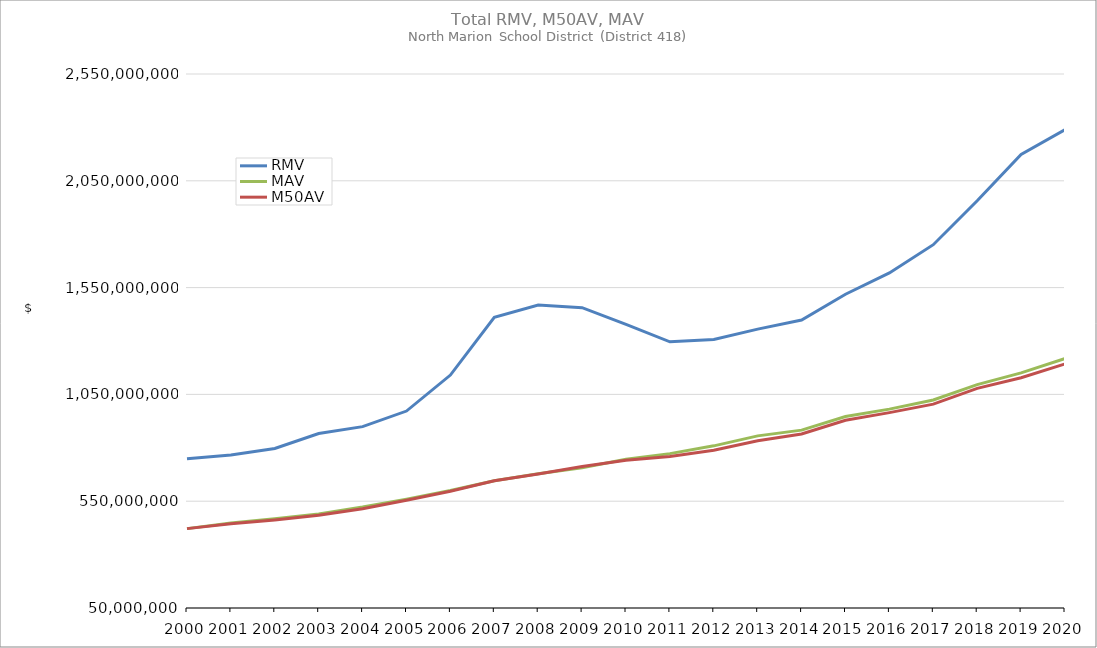
| Category | RMV | MAV | M50AV |
|---|---|---|---|
| 2000.0 | 748442697 | 421626962 | 421624970 |
| 2001.0 | 766622245 | 447420121 | 444534563 |
| 2002.0 | 796523828 | 467546030 | 462523133 |
| 2003.0 | 866915146 | 490197947 | 484249673 |
| 2004.0 | 899188326 | 522474164 | 515009715 |
| 2005.0 | 972078687 | 559697803 | 554751864 |
| 2006.0 | 1140555730 | 599814043 | 596354579 |
| 2007.0 | 1410534043 | 646142942 | 645790557 |
| 2008.0 | 1468187447 | 678929714 | 677095254 |
| 2009.0 | 1456028941 | 706872454 | 712036013 |
| 2010.0 | 1377549049 | 746715412 | 741252470 |
| 2011.0 | 1296366771 | 772769880 | 759396014 |
| 2012.0 | 1307324621 | 809173252 | 788333297 |
| 2013.0 | 1355682811 | 855796494 | 832774398 |
| 2014.0 | 1397917663 | 882651467 | 864750366 |
| 2015.0 | 1518853859 | 946556636 | 928581818 |
| 2016.0 | 1618630529 | 981106465 | 964772268 |
| 2017.0 | 1750875122 | 1023626559 | 1004481806 |
| 2018.0 | 1956709123 | 1095856165 | 1078339491 |
| 2019.0 | 2172930679 | 1150629630 | 1128262657 |
| 2020.0 | 2289555497 | 1218042136 | 1192441968 |